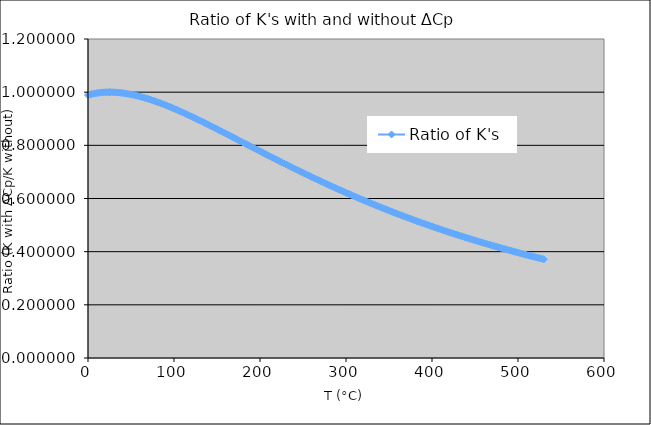
| Category | Ratio of K's |
|---|---|
| 0.0 | 0.989 |
| 2.0 | 0.991 |
| 4.0 | 0.993 |
| 6.0 | 0.994 |
| 8.0 | 0.995 |
| 10.0 | 0.996 |
| 12.0 | 0.997 |
| 14.0 | 0.998 |
| 16.0 | 0.999 |
| 18.0 | 0.999 |
| 20.0 | 1 |
| 22.0 | 1 |
| 24.0 | 1 |
| 25.0 | 1 |
| 26.0 | 1 |
| 28.0 | 1 |
| 30.0 | 1 |
| 32.0 | 0.999 |
| 34.0 | 0.999 |
| 36.0 | 0.998 |
| 38.0 | 0.998 |
| 40.0 | 0.997 |
| 42.0 | 0.996 |
| 44.0 | 0.995 |
| 46.0 | 0.994 |
| 48.0 | 0.993 |
| 50.0 | 0.991 |
| 52.0 | 0.99 |
| 54.0 | 0.989 |
| 56.0 | 0.987 |
| 58.0 | 0.986 |
| 60.0 | 0.984 |
| 62.0 | 0.982 |
| 64.0 | 0.98 |
| 66.0 | 0.978 |
| 68.0 | 0.977 |
| 70.0 | 0.975 |
| 72.0 | 0.972 |
| 74.0 | 0.97 |
| 76.0 | 0.968 |
| 78.0 | 0.966 |
| 80.0 | 0.964 |
| 82.0 | 0.961 |
| 84.0 | 0.959 |
| 86.0 | 0.956 |
| 88.0 | 0.954 |
| 90.0 | 0.951 |
| 92.0 | 0.949 |
| 94.0 | 0.946 |
| 96.0 | 0.943 |
| 98.0 | 0.941 |
| 100.0 | 0.938 |
| 102.0 | 0.935 |
| 104.0 | 0.932 |
| 106.0 | 0.93 |
| 108.0 | 0.927 |
| 110.0 | 0.924 |
| 112.0 | 0.921 |
| 114.0 | 0.918 |
| 116.0 | 0.915 |
| 118.0 | 0.912 |
| 120.0 | 0.909 |
| 122.0 | 0.906 |
| 124.0 | 0.903 |
| 126.0 | 0.9 |
| 128.0 | 0.896 |
| 130.0 | 0.893 |
| 132.0 | 0.89 |
| 134.0 | 0.887 |
| 136.0 | 0.884 |
| 138.0 | 0.881 |
| 140.0 | 0.877 |
| 142.0 | 0.874 |
| 144.0 | 0.871 |
| 146.0 | 0.868 |
| 148.0 | 0.864 |
| 150.0 | 0.861 |
| 152.0 | 0.858 |
| 154.0 | 0.854 |
| 156.0 | 0.851 |
| 158.0 | 0.848 |
| 160.0 | 0.844 |
| 162.0 | 0.841 |
| 164.0 | 0.838 |
| 166.0 | 0.834 |
| 168.0 | 0.831 |
| 170.0 | 0.828 |
| 172.0 | 0.824 |
| 174.0 | 0.821 |
| 176.0 | 0.818 |
| 178.0 | 0.814 |
| 180.0 | 0.811 |
| 182.0 | 0.808 |
| 184.0 | 0.804 |
| 186.0 | 0.801 |
| 188.0 | 0.798 |
| 190.0 | 0.794 |
| 192.0 | 0.791 |
| 194.0 | 0.788 |
| 196.0 | 0.784 |
| 198.0 | 0.781 |
| 200.0 | 0.778 |
| 202.0 | 0.774 |
| 204.0 | 0.771 |
| 206.0 | 0.768 |
| 208.0 | 0.764 |
| 210.0 | 0.761 |
| 212.0 | 0.758 |
| 214.0 | 0.755 |
| 216.0 | 0.751 |
| 218.0 | 0.748 |
| 220.0 | 0.745 |
| 222.0 | 0.741 |
| 224.0 | 0.738 |
| 226.0 | 0.735 |
| 228.0 | 0.732 |
| 230.0 | 0.728 |
| 232.0 | 0.725 |
| 234.0 | 0.722 |
| 236.0 | 0.719 |
| 238.0 | 0.716 |
| 240.0 | 0.712 |
| 242.0 | 0.709 |
| 244.0 | 0.706 |
| 246.0 | 0.703 |
| 248.0 | 0.7 |
| 250.0 | 0.697 |
| 252.0 | 0.694 |
| 254.0 | 0.69 |
| 256.0 | 0.687 |
| 258.0 | 0.684 |
| 260.0 | 0.681 |
| 262.0 | 0.678 |
| 264.0 | 0.675 |
| 266.0 | 0.672 |
| 268.0 | 0.669 |
| 270.0 | 0.666 |
| 272.0 | 0.663 |
| 274.0 | 0.66 |
| 276.0 | 0.657 |
| 278.0 | 0.654 |
| 280.0 | 0.651 |
| 282.0 | 0.648 |
| 284.0 | 0.645 |
| 286.0 | 0.642 |
| 288.0 | 0.639 |
| 290.0 | 0.636 |
| 292.0 | 0.633 |
| 294.0 | 0.63 |
| 296.0 | 0.628 |
| 298.0 | 0.625 |
| 300.0 | 0.622 |
| 302.0 | 0.619 |
| 304.0 | 0.616 |
| 306.0 | 0.613 |
| 308.0 | 0.611 |
| 310.0 | 0.608 |
| 312.0 | 0.605 |
| 314.0 | 0.602 |
| 316.0 | 0.599 |
| 318.0 | 0.597 |
| 320.0 | 0.594 |
| 322.0 | 0.591 |
| 324.0 | 0.589 |
| 326.0 | 0.586 |
| 328.0 | 0.583 |
| 330.0 | 0.581 |
| 332.0 | 0.578 |
| 334.0 | 0.575 |
| 336.0 | 0.573 |
| 338.0 | 0.57 |
| 340.0 | 0.567 |
| 342.0 | 0.565 |
| 344.0 | 0.562 |
| 346.0 | 0.56 |
| 348.0 | 0.557 |
| 350.0 | 0.555 |
| 352.0 | 0.552 |
| 354.0 | 0.549 |
| 356.0 | 0.547 |
| 358.0 | 0.544 |
| 360.0 | 0.542 |
| 362.0 | 0.54 |
| 364.0 | 0.537 |
| 366.0 | 0.535 |
| 368.0 | 0.532 |
| 370.0 | 0.53 |
| 372.0 | 0.527 |
| 374.0 | 0.525 |
| 376.0 | 0.523 |
| 378.0 | 0.52 |
| 380.0 | 0.518 |
| 382.0 | 0.515 |
| 384.0 | 0.513 |
| 386.0 | 0.511 |
| 388.0 | 0.508 |
| 390.0 | 0.506 |
| 392.0 | 0.504 |
| 394.0 | 0.502 |
| 396.0 | 0.499 |
| 398.0 | 0.497 |
| 400.0 | 0.495 |
| 402.0 | 0.493 |
| 404.0 | 0.49 |
| 406.0 | 0.488 |
| 408.0 | 0.486 |
| 410.0 | 0.484 |
| 412.0 | 0.482 |
| 414.0 | 0.479 |
| 416.0 | 0.477 |
| 418.0 | 0.475 |
| 420.0 | 0.473 |
| 422.0 | 0.471 |
| 424.0 | 0.469 |
| 426.0 | 0.467 |
| 428.0 | 0.465 |
| 430.0 | 0.463 |
| 432.0 | 0.46 |
| 434.0 | 0.458 |
| 436.0 | 0.456 |
| 438.0 | 0.454 |
| 440.0 | 0.452 |
| 442.0 | 0.45 |
| 444.0 | 0.448 |
| 446.0 | 0.446 |
| 448.0 | 0.444 |
| 450.0 | 0.442 |
| 452.0 | 0.44 |
| 454.0 | 0.438 |
| 456.0 | 0.436 |
| 458.0 | 0.435 |
| 460.0 | 0.433 |
| 462.0 | 0.431 |
| 464.0 | 0.429 |
| 466.0 | 0.427 |
| 468.0 | 0.425 |
| 470.0 | 0.423 |
| 472.0 | 0.421 |
| 474.0 | 0.419 |
| 476.0 | 0.418 |
| 478.0 | 0.416 |
| 480.0 | 0.414 |
| 482.0 | 0.412 |
| 484.0 | 0.41 |
| 486.0 | 0.409 |
| 488.0 | 0.407 |
| 490.0 | 0.405 |
| 492.0 | 0.403 |
| 494.0 | 0.402 |
| 496.0 | 0.4 |
| 498.0 | 0.398 |
| 500.0 | 0.396 |
| 502.0 | 0.395 |
| 504.0 | 0.393 |
| 506.0 | 0.391 |
| 508.0 | 0.39 |
| 510.0 | 0.388 |
| 512.0 | 0.386 |
| 514.0 | 0.384 |
| 516.0 | 0.383 |
| 518.0 | 0.381 |
| 520.0 | 0.38 |
| 522.0 | 0.378 |
| 524.0 | 0.376 |
| 526.0 | 0.375 |
| 528.0 | 0.373 |
| 530.0 | 0.371 |